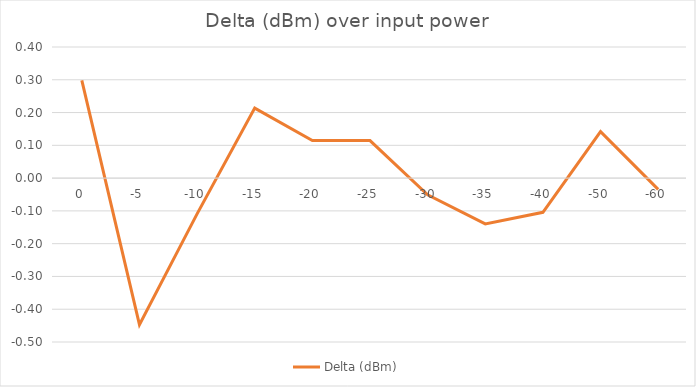
| Category | Delta (dBm) |
|---|---|
| 0.0 | 0.298 |
| -5.0 | -0.447 |
| -10.0 | -0.109 |
| -15.0 | 0.213 |
| -20.0 | 0.115 |
| -25.0 | 0.114 |
| -30.0 | -0.051 |
| -35.0 | -0.14 |
| -40.0 | -0.104 |
| -50.0 | 0.142 |
| -60.0 | -0.034 |